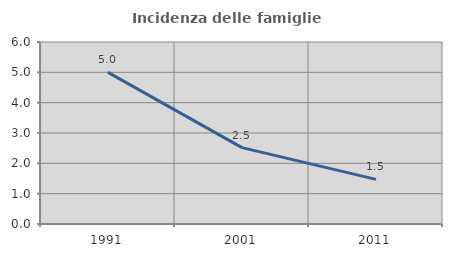
| Category | Incidenza delle famiglie numerose |
|---|---|
| 1991.0 | 5 |
| 2001.0 | 2.517 |
| 2011.0 | 1.471 |